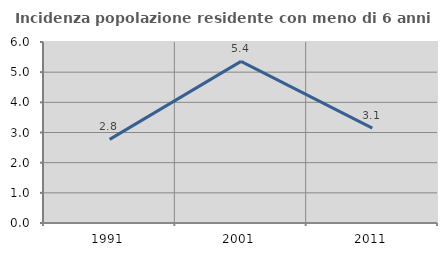
| Category | Incidenza popolazione residente con meno di 6 anni |
|---|---|
| 1991.0 | 2.773 |
| 2001.0 | 5.357 |
| 2011.0 | 3.142 |